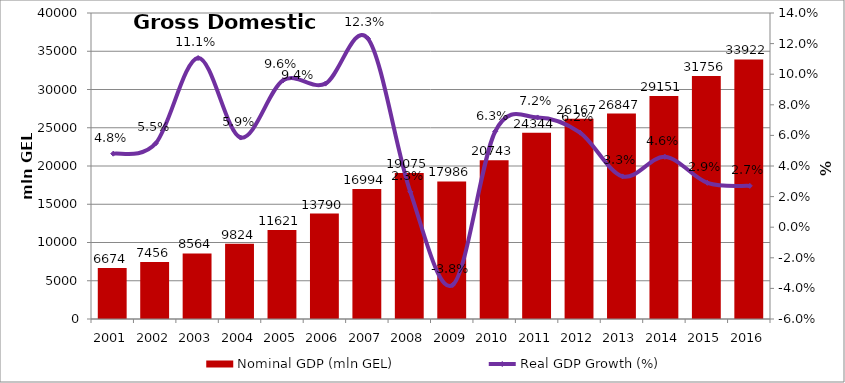
| Category | Nominal GDP (mln GEL) |
|---|---|
| 2001.0 | 6673.998 |
| 2002.0 | 7456.026 |
| 2003.0 | 8564.093 |
| 2004.0 | 9824.295 |
| 2005.0 | 11620.942 |
| 2006.0 | 13789.913 |
| 2007.0 | 16993.779 |
| 2008.0 | 19074.852 |
| 2009.0 | 17985.955 |
| 2010.0 | 20743.364 |
| 2011.0 | 24343.987 |
| 2012.0 | 26167.284 |
| 2013.0 | 26847.354 |
| 2014.0 | 29150.5 |
| 2015.0 | 31755.6 |
| 2016.0 | 33921.6 |